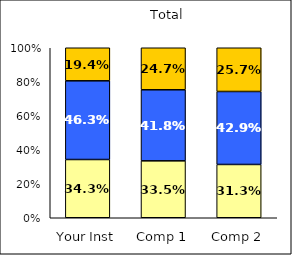
| Category | Low Job Satisfaction: Workplace | Average Job Satisfaction: Workplace | High Job Satisfaction: Workplace |
|---|---|---|---|
| Your Inst | 0.343 | 0.463 | 0.194 |
| Comp 1 | 0.335 | 0.418 | 0.247 |
| Comp 2 | 0.313 | 0.429 | 0.257 |